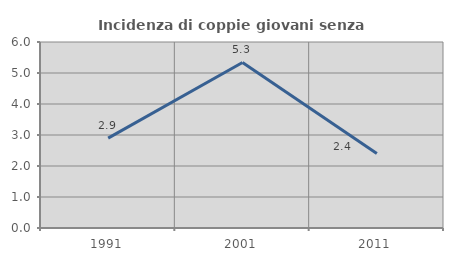
| Category | Incidenza di coppie giovani senza figli |
|---|---|
| 1991.0 | 2.899 |
| 2001.0 | 5.34 |
| 2011.0 | 2.406 |